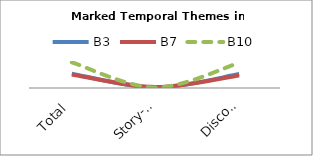
| Category | B3 | B7 | B10 |
|---|---|---|---|
| Total | 32 | 30 | 57 |
| Story-time | 1 | 2 | 1 |
| Discourse-time | 31 | 28 | 56 |